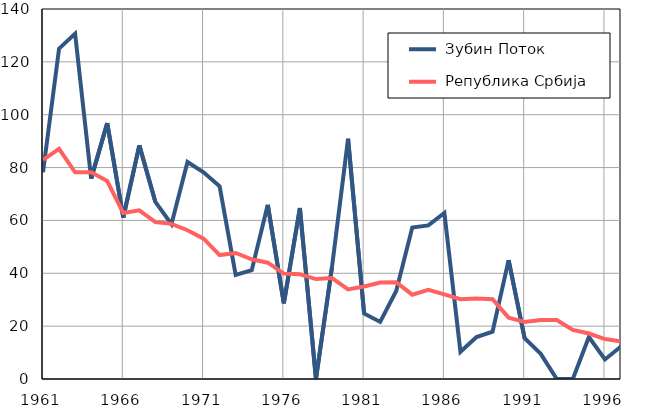
| Category |  Зубин Поток |  Република Србија |
|---|---|---|
| 1961.0 | 78.2 | 82.9 |
| 1962.0 | 125 | 87.1 |
| 1963.0 | 130.7 | 78.2 |
| 1964.0 | 75.8 | 78.2 |
| 1965.0 | 96.8 | 74.9 |
| 1966.0 | 61.1 | 62.8 |
| 1967.0 | 88.4 | 63.8 |
| 1968.0 | 67 | 59.4 |
| 1969.0 | 58.6 | 58.7 |
| 1970.0 | 82.1 | 56.3 |
| 1971.0 | 78.2 | 53.1 |
| 1972.0 | 72.9 | 46.9 |
| 1973.0 | 39.4 | 47.7 |
| 1974.0 | 41.2 | 45.3 |
| 1975.0 | 65.9 | 44 |
| 1976.0 | 28.6 | 39.9 |
| 1977.0 | 64.7 | 39.6 |
| 1978.0 | 0 | 37.8 |
| 1979.0 | 42.4 | 38.2 |
| 1980.0 | 90.9 | 33.9 |
| 1981.0 | 24.8 | 35 |
| 1982.0 | 21.6 | 36.5 |
| 1983.0 | 33.3 | 36.6 |
| 1984.0 | 57.3 | 31.9 |
| 1985.0 | 58.1 | 33.7 |
| 1986.0 | 62.8 | 32 |
| 1987.0 | 10.3 | 30.2 |
| 1988.0 | 15.9 | 30.5 |
| 1989.0 | 17.9 | 30.2 |
| 1990.0 | 45 | 23.2 |
| 1991.0 | 15.4 | 21.6 |
| 1992.0 | 9.5 | 22.3 |
| 1993.0 | 0 | 22.3 |
| 1994.0 | 0 | 18.6 |
| 1995.0 | 15.9 | 17.2 |
| 1996.0 | 7.4 | 15.1 |
| 1997.0 | 12.3 | 14.2 |